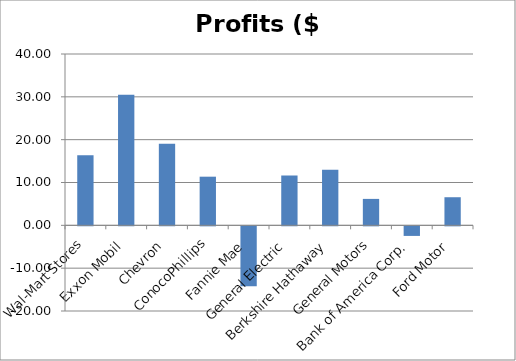
| Category | Profits ($ billions) |
|---|---|
| Wal-Mart Stores | 16.389 |
| Exxon Mobil | 30.46 |
| Chevron | 19.024 |
| ConocoPhillips | 11.358 |
| Fannie Mae | -14.014 |
| General Electric | 11.644 |
| Berkshire Hathaway | 12.967 |
| General Motors | 6.172 |
| Bank of America Corp. | -2.238 |
| Ford Motor | 6.561 |